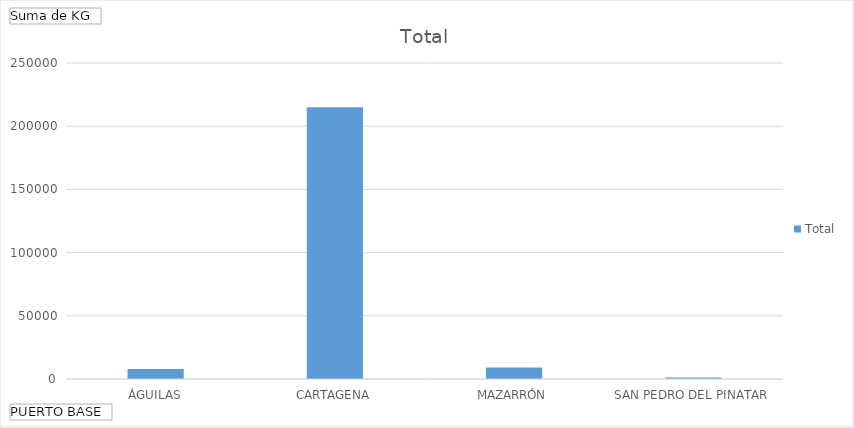
| Category | Total |
|---|---|
| ÁGUILAS | 7883 |
| CARTAGENA | 215085 |
| MAZARRÓN | 9096 |
| SAN PEDRO DEL PINATAR | 1203 |